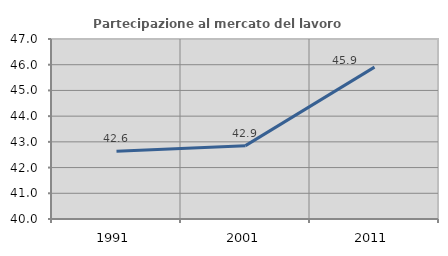
| Category | Partecipazione al mercato del lavoro  femminile |
|---|---|
| 1991.0 | 42.633 |
| 2001.0 | 42.852 |
| 2011.0 | 45.907 |